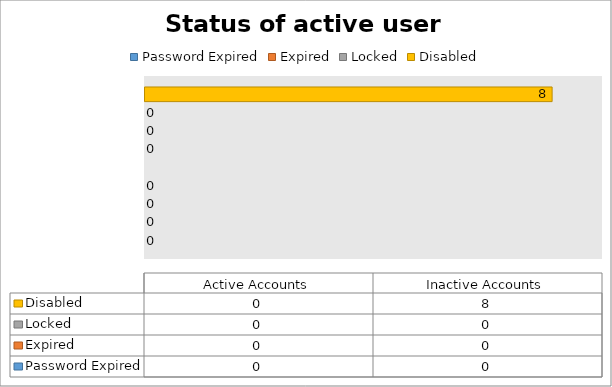
| Category | Password Expired | Expired | Locked | Disabled |
|---|---|---|---|---|
| Active Accounts | 0 | 0 | 0 | 0 |
| Inactive Accounts | 0 | 0 | 0 | 8 |